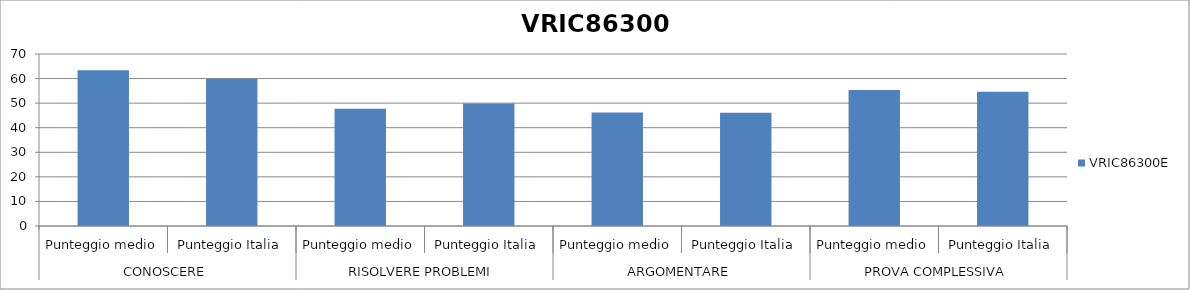
| Category | VRIC86300E |
|---|---|
| 0 | 63.4 |
| 1 | 59.9 |
| 2 | 47.7 |
| 3 | 49.9 |
| 4 | 46.2 |
| 5 | 46.1 |
| 6 | 55.3 |
| 7 | 54.6 |